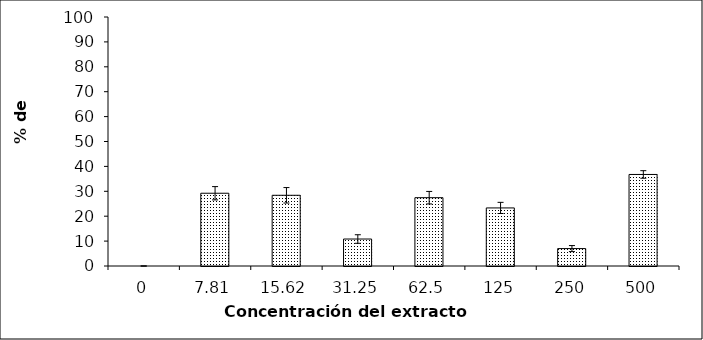
| Category | Series 0 |
|---|---|
| 0.0 | 0 |
| 7.81 | 29.218 |
| 15.62 | 28.395 |
| 31.25 | 10.837 |
| 62.5 | 27.435 |
| 125.0 | 23.32 |
| 250.0 | 6.996 |
| 500.0 | 36.763 |